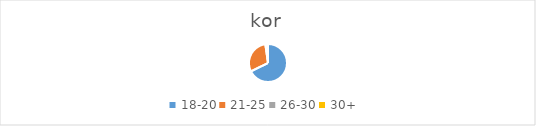
| Category | Series 0 |
|---|---|
| 18-20 | 420 |
| 21-25 | 186 |
| 26-30 | 10 |
| 30+ | 4 |